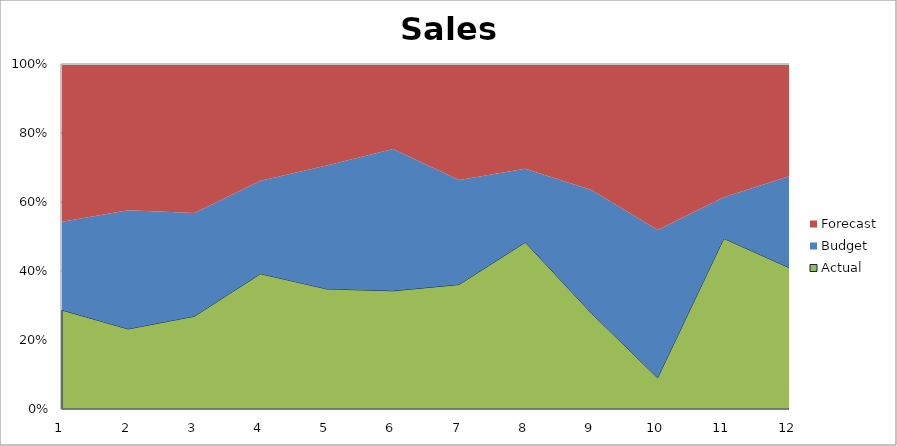
| Category | Actual | Budget | Forecast |
|---|---|---|---|
| 0 | 1970 | 1760 | 3140 |
| 1 | 1740 | 2580 | 3180 |
| 2 | 1600 | 1780 | 2570 |
| 3 | 2270 | 1560 | 1960 |
| 4 | 2840 | 2920 | 2400 |
| 5 | 1600 | 1920 | 1150 |
| 6 | 2320 | 1950 | 2160 |
| 7 | 2880 | 1270 | 1810 |
| 8 | 1990 | 2560 | 2620 |
| 9 | 500 | 2370 | 2660 |
| 10 | 2190 | 530 | 1710 |
| 11 | 2080 | 1360 | 1650 |